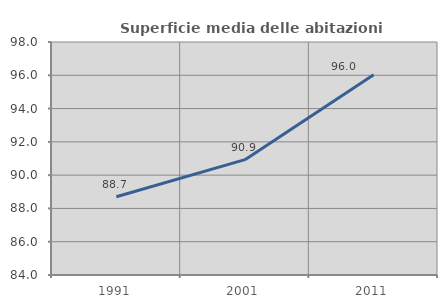
| Category | Superficie media delle abitazioni occupate |
|---|---|
| 1991.0 | 88.704 |
| 2001.0 | 90.93 |
| 2011.0 | 96.026 |